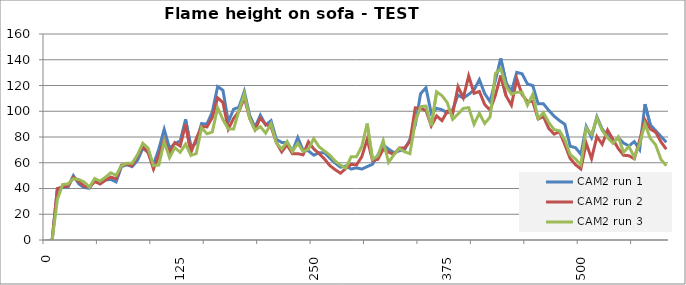
| Category | CAM2 run 1 | CAM2 run 2 | CAM2 run 3 |
|---|---|---|---|
| 0.0 | -1 | -1 | -1 |
| 5.0 | -1 | -1 | -1 |
| 10.0 | 39.713 | 39.899 | 31.506 |
| 15.0 | 40.69 | 41.363 | 43.108 |
| 20.0 | 41.178 | 41.851 | 43.537 |
| 25.0 | 49.974 | 48.688 | 47.557 |
| 30.0 | 43.651 | 45.48 | 47.058 |
| 35.0 | 40.722 | 41.9 | 45.064 |
| 40.0 | 40.234 | 40.981 | 41.077 |
| 45.0 | 46.581 | 45.364 | 47.724 |
| 50.0 | 43.687 | 43.605 | 45.737 |
| 55.0 | 46.614 | 46.452 | 48.718 |
| 60.0 | 47.102 | 48.885 | 52.198 |
| 65.0 | 45.15 | 47.557 | 50.209 |
| 70.0 | 56.975 | 58.193 | 57.671 |
| 75.0 | 58.438 | 58.68 | 59.662 |
| 80.0 | 56.975 | 57.762 | 59.662 |
| 85.0 | 61.893 | 65.556 | 66.136 |
| 90.0 | 71.198 | 72.484 | 75.141 |
| 95.0 | 68.273 | 67.613 | 71.156 |
| 100.0 | 58.579 | 55.123 | 57.716 |
| 105.0 | 70.811 | 65.736 | 58.24 |
| 110.0 | 85.954 | 77.792 | 76.293 |
| 115.0 | 71.208 | 67.353 | 63.916 |
| 120.0 | 74.958 | 75.615 | 71.712 |
| 125.0 | 76.835 | 72.966 | 68.134 |
| 130.0 | 93.664 | 89.925 | 74.507 |
| 135.0 | 72.145 | 68.058 | 65.795 |
| 140.0 | 75.427 | 78.537 | 67.175 |
| 145.0 | 90.45 | 88.214 | 87.196 |
| 150.0 | 89.981 | 87.793 | 82.514 |
| 155.0 | 99.381 | 95.168 | 83.854 |
| 160.0 | 119.138 | 110.46 | 102.731 |
| 165.0 | 116.314 | 106.771 | 93.52 |
| 170.0 | 91.82 | 86.139 | 86.193 |
| 175.0 | 101.63 | 94.418 | 86.193 |
| 180.0 | 103.107 | 99.942 | 100.495 |
| 185.0 | 115.407 | 110.537 | 113.388 |
| 190.0 | 96.864 | 94.635 | 94.594 |
| 195.0 | 87.479 | 85.801 | 85.314 |
| 200.0 | 96.923 | 94.707 | 88.073 |
| 205.0 | 89.395 | 89.636 | 83.016 |
| 210.0 | 92.688 | 88.254 | 90.373 |
| 215.0 | 78.151 | 75.82 | 75.255 |
| 220.0 | 75.803 | 68.462 | 70.668 |
| 225.0 | 75.803 | 73.98 | 76.538 |
| 230.0 | 68.761 | 67.031 | 68.681 |
| 235.0 | 79.561 | 67.084 | 75.115 |
| 240.0 | 69.7 | 66.165 | 68.729 |
| 245.0 | 69.184 | 76.28 | 70.566 |
| 250.0 | 65.898 | 70.761 | 78.718 |
| 255.0 | 67.775 | 67.031 | 72.357 |
| 260.0 | 67.775 | 62.894 | 69.141 |
| 265.0 | 63.552 | 57.844 | 65.926 |
| 270.0 | 59.8 | 54.633 | 61.336 |
| 275.0 | 56.519 | 51.884 | 58.126 |
| 280.0 | 57.456 | 55.55 | 55.835 |
| 285.0 | 55.114 | 58.761 | 64.654 |
| 290.0 | 56.051 | 58.303 | 64.654 |
| 295.0 | 55.114 | 64.787 | 72.862 |
| 300.0 | 56.988 | 78.329 | 90.414 |
| 305.0 | 58.862 | 61.699 | 62.623 |
| 310.0 | 65.947 | 62.681 | 65.361 |
| 315.0 | 73.924 | 70.47 | 77.196 |
| 320.0 | 70.638 | 68.241 | 60.271 |
| 325.0 | 67.823 | 66.41 | 66.208 |
| 330.0 | 69.23 | 71.448 | 71.241 |
| 335.0 | 70.169 | 71.448 | 68.495 |
| 340.0 | 78.036 | 76.493 | 67.123 |
| 345.0 | 89.212 | 102.636 | 92.022 |
| 350.0 | 113.659 | 102.147 | 103.53 |
| 355.0 | 118.204 | 100.681 | 104.03 |
| 360.0 | 98.295 | 88.607 | 88.614 |
| 365.0 | 102.274 | 96.365 | 115.088 |
| 370.0 | 101.151 | 92.714 | 112.112 |
| 375.0 | 98.878 | 100.016 | 106.669 |
| 380.0 | 101.162 | 98.123 | 93.692 |
| 385.0 | 112.552 | 119.07 | 97.751 |
| 390.0 | 110.28 | 110.456 | 102.24 |
| 395.0 | 113.12 | 127.501 | 102.812 |
| 400.0 | 116.527 | 113.919 | 89.903 |
| 405.0 | 124.515 | 115.378 | 98.368 |
| 410.0 | 113.727 | 105.229 | 90.5 |
| 415.0 | 107.483 | 100.86 | 95.474 |
| 420.0 | 123.969 | 112.403 | 129.19 |
| 425.0 | 141.048 | 127.828 | 133.211 |
| 430.0 | 122.207 | 111.945 | 119.236 |
| 435.0 | 115.391 | 104.685 | 113.249 |
| 440.0 | 130.193 | 125.038 | 114.745 |
| 445.0 | 129.102 | 112.914 | 114.745 |
| 450.0 | 121.156 | 107.588 | 104.769 |
| 455.0 | 119.952 | 107.588 | 113.249 |
| 460.0 | 105.78 | 93.976 | 94.34 |
| 465.0 | 105.757 | 95.826 | 98.824 |
| 470.0 | 100.671 | 86.571 | 91.198 |
| 475.0 | 96.13 | 82.234 | 85.747 |
| 480.0 | 92.725 | 84.161 | 84.75 |
| 485.0 | 89.888 | 74.066 | 77.815 |
| 490.0 | 72.836 | 63.325 | 66.37 |
| 495.0 | 71.701 | 58.469 | 62.891 |
| 500.0 | 66.596 | 55.174 | 58.421 |
| 505.0 | 88.185 | 75.23 | 87.207 |
| 510.0 | 79.71 | 63.202 | 81.942 |
| 515.0 | 95.74 | 80.33 | 94.882 |
| 520.0 | 86.113 | 74.382 | 85.032 |
| 525.0 | 81.019 | 85.399 | 79.569 |
| 530.0 | 75.928 | 78.206 | 75.103 |
| 535.0 | 79.322 | 71.044 | 80.066 |
| 540.0 | 75.309 | 65.818 | 68.165 |
| 545.0 | 73.046 | 65.471 | 72.624 |
| 550.0 | 76.441 | 63.111 | 64.207 |
| 555.0 | 70.218 | 77.466 | 74.607 |
| 560.0 | 105.506 | 93.294 | 90.236 |
| 565.0 | 89.465 | 86.133 | 78.843 |
| 570.0 | 84.933 | 83.753 | 73.9 |
| 575.0 | 80.403 | 76.168 | 62.566 |
| 580.0 | 75.875 | 70.515 | 57.658 |